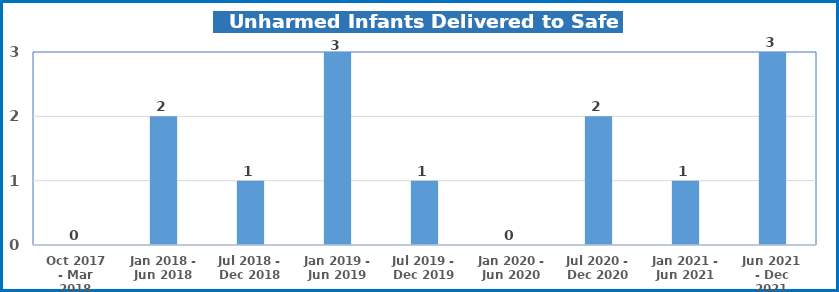
| Category | Series 0 |
|---|---|
| Oct 2017 - Mar 2018 | 0 |
| Jan 2018 - Jun 2018 | 2 |
| Jul 2018 - Dec 2018 | 1 |
| Jan 2019 - Jun 2019 | 3 |
| Jul 2019 - Dec 2019 | 1 |
| Jan 2020 - Jun 2020 | 0 |
| Jul 2020 - Dec 2020 | 2 |
| Jan 2021 - Jun 2021 | 1 |
| Jun 2021 - Dec 2021 | 3 |